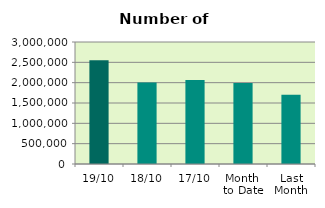
| Category | Series 0 |
|---|---|
| 19/10 | 2548784 |
| 18/10 | 2004122 |
| 17/10 | 2062832 |
| Month 
to Date | 1993015.467 |
| Last
Month | 1700207.9 |